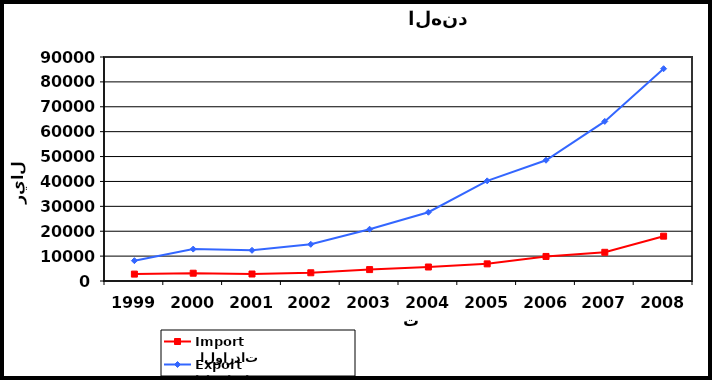
| Category |  الواردات           Import | الصادرات          Export |
|---|---|---|
| 1999.0 | 2770 | 8175 |
| 2000.0 | 3132 | 12823 |
| 2001.0 | 2811 | 12336 |
| 2002.0 | 3307 | 14742 |
| 2003.0 | 4589 | 20804 |
| 2004.0 | 5622 | 27625 |
| 2005.0 | 6884 | 40237 |
| 2006.0 | 9864 | 48520 |
| 2007.0 | 11529 | 64120 |
| 2008.0 | 18012 | 85295 |